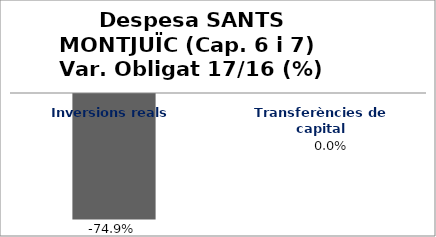
| Category | Series 0 |
|---|---|
| Inversions reals | -0.749 |
| Transferències de capital | 0 |